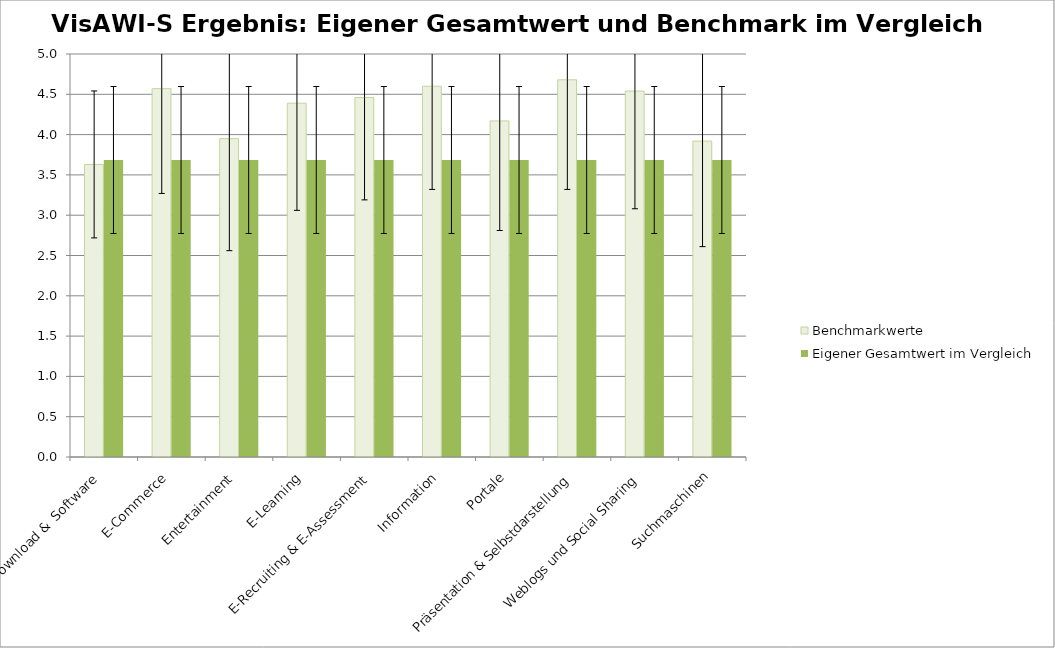
| Category | Benchmarkwerte | Benchmark Werte | Eigener Gesamtwert im Vergleich |
|---|---|---|---|
| Download &  Software | 3.63 |  | 3.685 |
| E-Commerce | 4.57 |  | 3.685 |
| Entertainment | 3.95 |  | 3.685 |
| E-Learning | 4.39 |  | 3.685 |
| E-Recruiting & E-Assessment | 4.46 |  | 3.685 |
| Information | 4.6 |  | 3.685 |
| Portale | 4.17 |  | 3.685 |
| Präsentation & Selbstdarstellung | 4.68 |  | 3.685 |
| Weblogs und Social Sharing | 4.54 |  | 3.685 |
| Suchmaschinen | 3.92 |  | 3.685 |